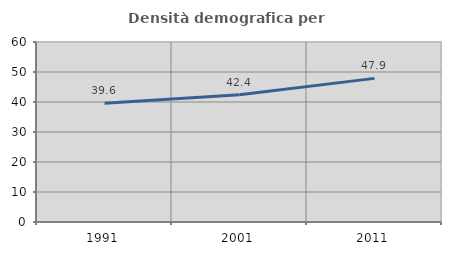
| Category | Densità demografica |
|---|---|
| 1991.0 | 39.606 |
| 2001.0 | 42.435 |
| 2011.0 | 47.875 |